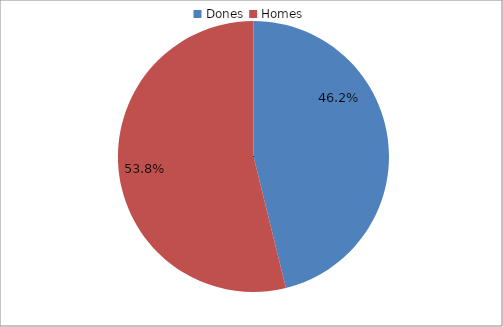
| Category | Series 0 |
|---|---|
| Dones | 0.462 |
| Homes | 0.538 |